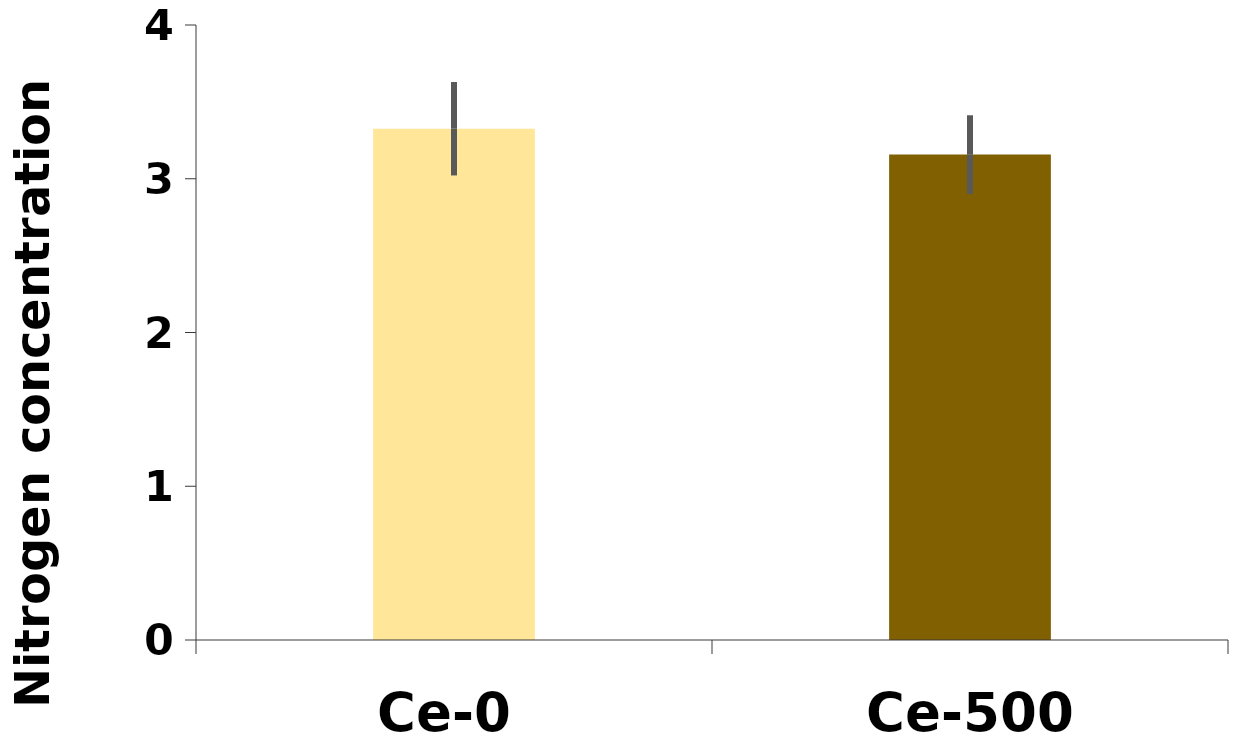
| Category | %N |
|---|---|
| Ce-0 | 3.325 |
| Ce-500 | 3.157 |